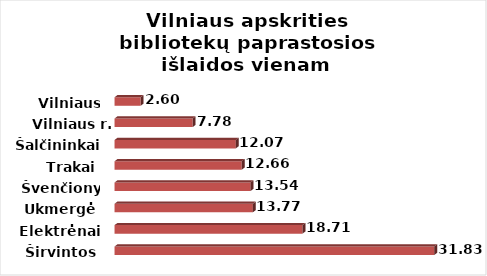
| Category | Series 0 |
|---|---|
| Širvintos | 31.831 |
| Elektrėnai | 18.709 |
| Ukmergė | 13.767 |
| Švenčionys | 13.543 |
| Trakai | 12.659 |
| Šalčininkai | 12.071 |
| Vilniaus r. | 7.779 |
| Vilniaus m. | 2.599 |